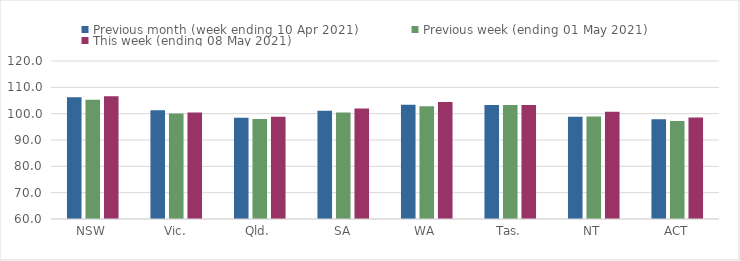
| Category | Previous month (week ending 10 Apr 2021) | Previous week (ending 01 May 2021) | This week (ending 08 May 2021) |
|---|---|---|---|
| NSW | 106.19 | 105.29 | 106.59 |
| Vic. | 101.3 | 100.02 | 100.47 |
| Qld. | 98.43 | 97.97 | 98.85 |
| SA | 101.08 | 100.43 | 101.92 |
| WA | 103.35 | 102.77 | 104.4 |
| Tas. | 103.32 | 103.32 | 103.32 |
| NT | 98.8 | 98.9 | 100.77 |
| ACT | 97.92 | 97.26 | 98.54 |